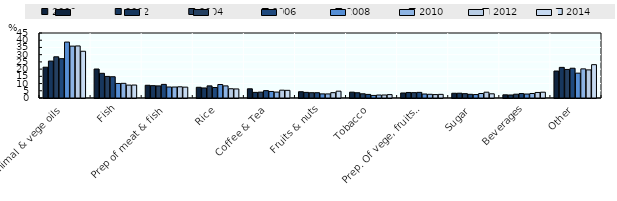
| Category | 2000 | 2002 | 2004 | 2006 | 2008 | 2010 | 2012 | 2014 |
|---|---|---|---|---|---|---|---|---|
| Animal & vege oils | 21.317 | 25.565 | 28.53 | 27.209 | 38.724 | 35.911 | 36.033 | 32.362 |
| Fish | 20.063 | 17.09 | 14.942 | 14.725 | 10.061 | 10.148 | 8.928 | 8.977 |
| Prep of meat & fish | 8.816 | 8.544 | 8.374 | 9.425 | 7.626 | 7.6 | 7.75 | 7.507 |
| Rice | 7.417 | 6.95 | 8.394 | 7.26 | 9.33 | 8.39 | 6.406 | 6.265 |
| Coffee & Tea | 6.378 | 3.885 | 4.06 | 5.105 | 4.531 | 4.096 | 5.42 | 5.302 |
| Fruits & nuts | 4.341 | 3.887 | 3.661 | 3.661 | 2.852 | 2.823 | 3.691 | 4.724 |
| Tobacco | 4.044 | 3.645 | 2.917 | 2.481 | 1.78 | 2.065 | 2.081 | 2.343 |
| Prep. Of vege, fruits & nuts | 3.475 | 3.827 | 3.704 | 3.896 | 2.766 | 2.573 | 2.363 | 2.517 |
| Sugar | 3.278 | 3.32 | 3.006 | 2.561 | 2.383 | 3.106 | 4.024 | 2.904 |
| Beverages | 2.196 | 2.092 | 2.632 | 3.065 | 2.745 | 3.119 | 3.84 | 4.016 |
| Other | 18.676 | 21.193 | 19.78 | 20.612 | 17.201 | 20.169 | 19.465 | 23.082 |